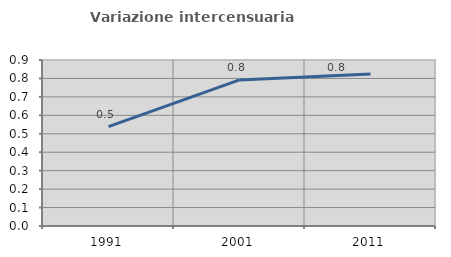
| Category | Variazione intercensuaria annua |
|---|---|
| 1991.0 | 0.538 |
| 2001.0 | 0.792 |
| 2011.0 | 0.824 |